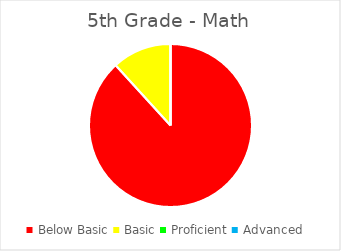
| Category | Series 0 |
|---|---|
| Below Basic | 0.882 |
| Basic | 0.118 |
| Proficient | 0 |
| Advanced | 0 |